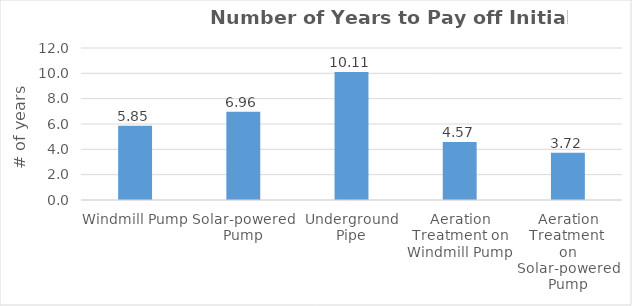
| Category | Series 0 |
|---|---|
| Windmill Pump | 5.853 |
| Solar-powered Pump | 6.964 |
| Underground Pipe | 10.106 |
| Aeration Treatment on Windmill Pump | 4.574 |
| Aeration Treatment 
on Solar-powered Pump | 3.722 |